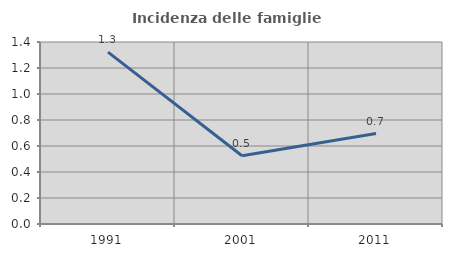
| Category | Incidenza delle famiglie numerose |
|---|---|
| 1991.0 | 1.322 |
| 2001.0 | 0.525 |
| 2011.0 | 0.695 |